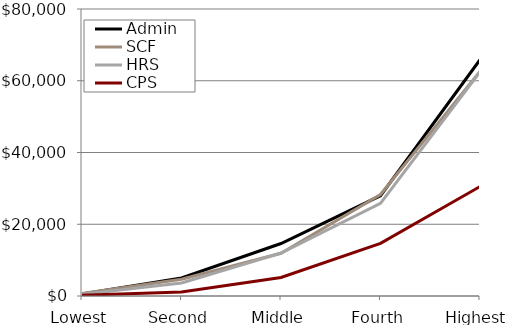
| Category | Admin | SCF | HRS | CPS |
|---|---|---|---|---|
| Lowest | 577.033 | 683.021 | 513.203 | 214.433 |
| Second | 5011.105 | 4669.838 | 3628.982 | 1113.241 |
| Middle | 14624.457 | 11922.3 | 11970.34 | 5168.614 |
| Fourth | 27955.923 | 28274.91 | 25804.48 | 14679.855 |
| Highest | 65857.891 | 62596.59 | 62448.49 | 30513.315 |